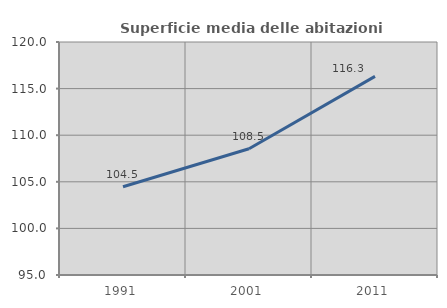
| Category | Superficie media delle abitazioni occupate |
|---|---|
| 1991.0 | 104.472 |
| 2001.0 | 108.541 |
| 2011.0 | 116.308 |